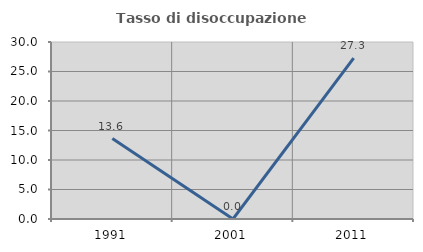
| Category | Tasso di disoccupazione giovanile  |
|---|---|
| 1991.0 | 13.636 |
| 2001.0 | 0 |
| 2011.0 | 27.273 |